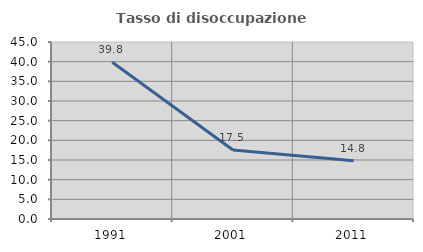
| Category | Tasso di disoccupazione giovanile  |
|---|---|
| 1991.0 | 39.85 |
| 2001.0 | 17.544 |
| 2011.0 | 14.815 |